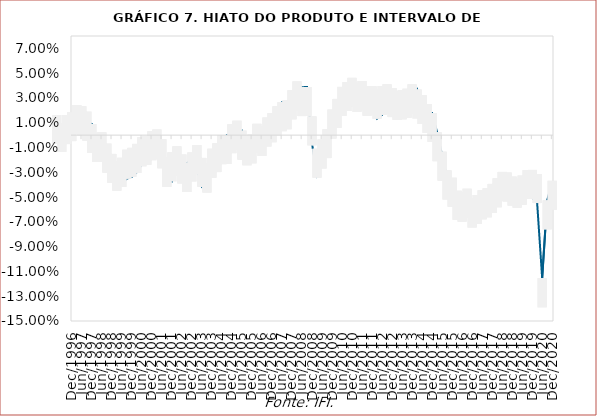
| Category | Hiato | Limite Inferior | Limite superior |
|---|---|---|---|
| 1996-03-01 | -0.007 | -0.007 | 0.016 |
| 1996-06-01 | -0.005 | -0.014 | 0.01 |
| 1996-09-01 | 0.016 | -0.007 | 0.016 |
| 1996-12-01 | 0.008 | -0.005 | 0.019 |
| 1997-03-01 | 0.012 | 0.001 | 0.024 |
| 1997-06-01 | 0.006 | 0 | 0.023 |
| 1997-09-01 | 0.01 | -0.004 | 0.019 |
| 1997-12-01 | 0.009 | -0.014 | 0.009 |
| 1998-03-01 | -0.017 | -0.022 | 0.002 |
| 1998-06-01 | -0.008 | -0.021 | 0.002 |
| 1998-09-01 | -0.013 | -0.03 | -0.007 |
| 1998-12-01 | -0.031 | -0.038 | -0.015 |
| 1999-03-01 | -0.037 | -0.045 | -0.022 |
| 1999-06-01 | -0.039 | -0.042 | -0.018 |
| 1999-09-01 | -0.035 | -0.035 | -0.012 |
| 1999-12-01 | -0.034 | -0.034 | -0.01 |
| 2000-03-01 | -0.03 | -0.03 | -0.007 |
| 2000-06-01 | -0.024 | -0.025 | -0.002 |
| 2000-09-01 | -0.017 | -0.024 | -0.001 |
| 2000-12-01 | -0.01 | -0.02 | 0.003 |
| 2001-03-01 | -0.012 | -0.019 | 0.005 |
| 2001-06-01 | -0.02 | -0.027 | -0.003 |
| 2001-09-01 | -0.033 | -0.042 | -0.018 |
| 2001-12-01 | -0.037 | -0.037 | -0.014 |
| 2002-03-01 | -0.027 | -0.032 | -0.009 |
| 2002-06-01 | -0.029 | -0.039 | -0.016 |
| 2002-09-01 | -0.023 | -0.046 | -0.023 |
| 2002-12-01 | -0.019 | -0.037 | -0.014 |
| 2003-03-01 | -0.027 | -0.031 | -0.008 |
| 2003-06-01 | -0.041 | -0.042 | -0.018 |
| 2003-09-01 | -0.037 | -0.046 | -0.023 |
| 2003-12-01 | -0.032 | -0.034 | -0.011 |
| 2004-03-01 | -0.025 | -0.03 | -0.007 |
| 2004-06-01 | -0.003 | -0.023 | 0 |
| 2004-09-01 | 0 | -0.023 | 0 |
| 2004-12-01 | 0.002 | -0.014 | 0.009 |
| 2005-03-01 | 0.002 | -0.012 | 0.012 |
| 2005-06-01 | 0.004 | -0.02 | 0.004 |
| 2005-09-01 | -0.008 | -0.024 | -0.001 |
| 2005-12-01 | -0.003 | -0.023 | 0.001 |
| 2006-03-01 | 0.004 | -0.014 | 0.009 |
| 2006-06-01 | -0.002 | -0.017 | 0.007 |
| 2006-09-01 | 0.007 | -0.009 | 0.014 |
| 2006-12-01 | 0.011 | -0.006 | 0.018 |
| 2007-03-01 | 0.02 | 0 | 0.023 |
| 2007-06-01 | 0.027 | 0.003 | 0.027 |
| 2007-09-01 | 0.026 | 0.005 | 0.028 |
| 2007-12-01 | 0.03 | 0.013 | 0.036 |
| 2008-03-01 | 0.032 | 0.02 | 0.043 |
| 2008-06-01 | 0.039 | 0.015 | 0.039 |
| 2008-09-01 | 0.039 | 0.016 | 0.039 |
| 2008-12-01 | -0.007 | -0.008 | 0.015 |
| 2009-03-01 | -0.032 | -0.034 | -0.011 |
| 2009-06-01 | -0.023 | -0.027 | -0.004 |
| 2009-09-01 | -0.01 | -0.019 | 0.005 |
| 2009-12-01 | 0.007 | -0.003 | 0.021 |
| 2010-03-01 | 0.019 | 0.006 | 0.029 |
| 2010-06-01 | 0.021 | 0.016 | 0.039 |
| 2010-09-01 | 0.021 | 0.02 | 0.043 |
| 2010-12-01 | 0.025 | 0.023 | 0.046 |
| 2011-03-01 | 0.03 | 0.019 | 0.042 |
| 2011-06-01 | 0.032 | 0.02 | 0.044 |
| 2011-09-01 | 0.022 | 0.016 | 0.039 |
| 2011-12-01 | 0.024 | 0.016 | 0.04 |
| 2012-03-01 | 0.013 | 0.013 | 0.037 |
| 2012-06-01 | 0.016 | 0.016 | 0.04 |
| 2012-09-01 | 0.027 | 0.018 | 0.041 |
| 2012-12-01 | 0.024 | 0.015 | 0.038 |
| 2013-03-01 | 0.024 | 0.012 | 0.036 |
| 2013-06-01 | 0.034 | 0.013 | 0.036 |
| 2013-09-01 | 0.034 | 0.014 | 0.037 |
| 2013-12-01 | 0.031 | 0.018 | 0.041 |
| 2014-03-01 | 0.037 | 0.014 | 0.037 |
| 2014-06-01 | 0.02 | 0.009 | 0.032 |
| 2014-09-01 | 0.018 | 0.002 | 0.025 |
| 2014-12-01 | 0.018 | -0.006 | 0.018 |
| 2015-03-01 | 0.002 | -0.021 | 0.002 |
| 2015-06-01 | -0.016 | -0.037 | -0.013 |
| 2015-09-01 | -0.034 | -0.052 | -0.028 |
| 2015-12-01 | -0.043 | -0.058 | -0.034 |
| 2016-03-01 | -0.059 | -0.068 | -0.045 |
| 2016-06-01 | -0.057 | -0.07 | -0.047 |
| 2016-09-01 | -0.059 | -0.067 | -0.043 |
| 2016-12-01 | -0.065 | -0.074 | -0.051 |
| 2017-03-01 | -0.058 | -0.072 | -0.048 |
| 2017-06-01 | -0.053 | -0.068 | -0.045 |
| 2017-09-01 | -0.054 | -0.066 | -0.043 |
| 2017-12-01 | -0.052 | -0.063 | -0.039 |
| 2018-03-01 | -0.046 | -0.058 | -0.035 |
| 2018-06-01 | -0.046 | -0.053 | -0.03 |
| 2018-09-01 | -0.043 | -0.054 | -0.03 |
| 2018-12-01 | -0.049 | -0.057 | -0.034 |
| 2019-03-01 | -0.045 | -0.058 | -0.035 |
| 2019-06-01 | -0.046 | -0.056 | -0.033 |
| 2019-09-01 | -0.05 | -0.052 | -0.028 |
| 2019-12-01 | -0.05 | -0.051 | -0.028 |
| 2020-03-01 | -0.055 | -0.055 | -0.031 |
| 2020-06-01 | -0.116 | -0.139 | -0.116 |
| 2020-09-01 | -0.053 | -0.076 | -0.053 |
| 2020-12-01 | -0.038 | -0.06 | -0.037 |